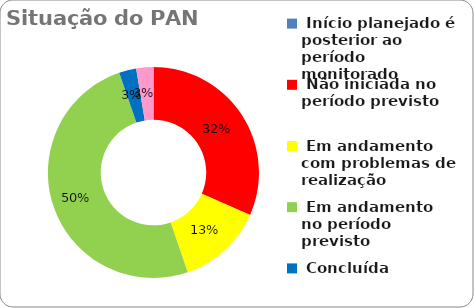
| Category | Series 0 |
|---|---|
|  Início planejado é posterior ao período monitorado | 0 |
|  Não iniciada no período previsto | 0.316 |
|  Em andamento com problemas de realização | 0.132 |
|  Em andamento no período previsto  | 0.5 |
|  Concluída | 0.026 |
|  Ações Novas - Pós monitoria | 0.026 |